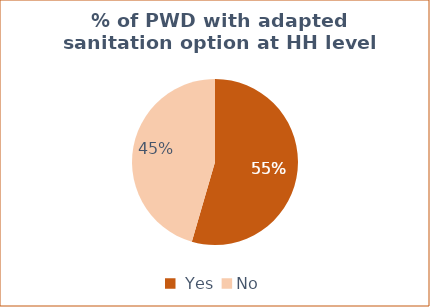
| Category |  # of PWD with adapted sanitation option at HH level |
|---|---|
|  Yes  | 254 |
| No | 212 |